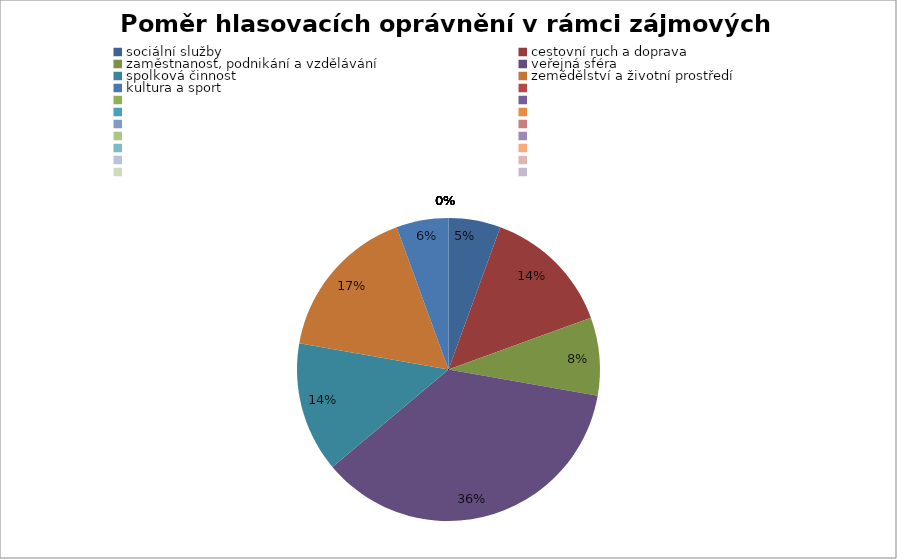
| Category | Series 0 |
|---|---|
| sociální služby | 0.056 |
| cestovní ruch a doprava | 0.139 |
| zaměstnanost, podnikání a vzdělávání | 0.083 |
| veřejná sféra | 0.361 |
| spolková činnost | 0.139 |
| zemědělství a životní prostředí | 0.167 |
| kultura a sport | 0.056 |